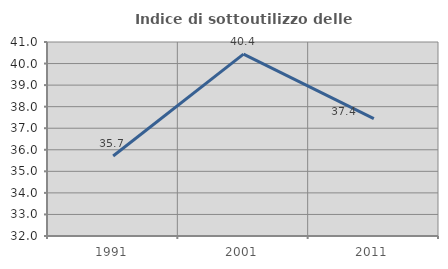
| Category | Indice di sottoutilizzo delle abitazioni  |
|---|---|
| 1991.0 | 35.709 |
| 2001.0 | 40.44 |
| 2011.0 | 37.446 |